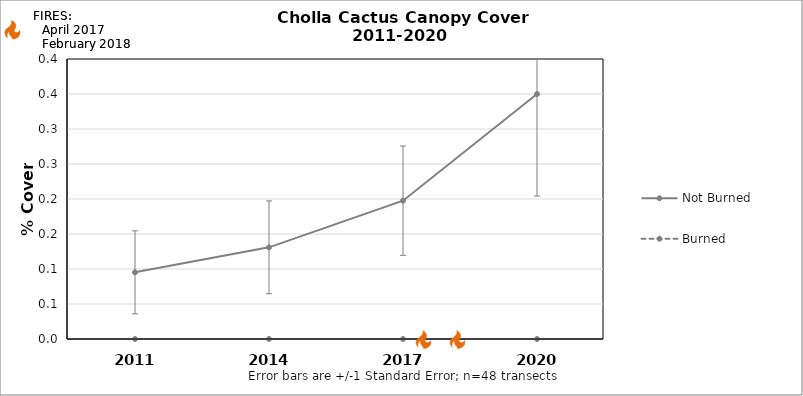
| Category | Not Burned | Burned |
|---|---|---|
| 2011.0 | 0.095 | 0 |
| 2014.0 | 0.131 | 0 |
| 2017.0 | 0.198 | 0 |
| 2020.0 | 0.35 | 0 |